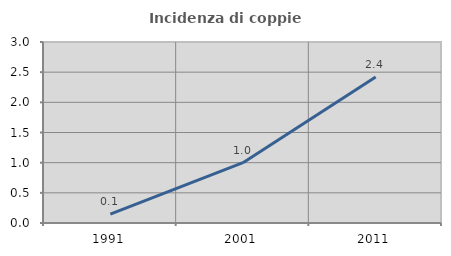
| Category | Incidenza di coppie miste |
|---|---|
| 1991.0 | 0.148 |
| 2001.0 | 1 |
| 2011.0 | 2.42 |